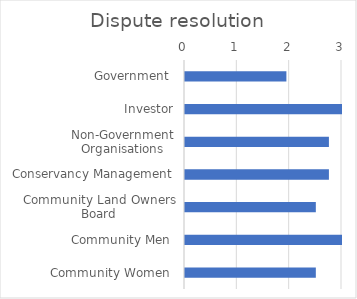
| Category | Dispute resolution |
|---|---|
| Government  | 1.938 |
| Investor | 3 |
| Non-Government Organisations | 2.75 |
| Conservancy Management | 2.75 |
| Community Land Owners Board | 2.5 |
| Community Men  | 3 |
| Community Women  | 2.5 |